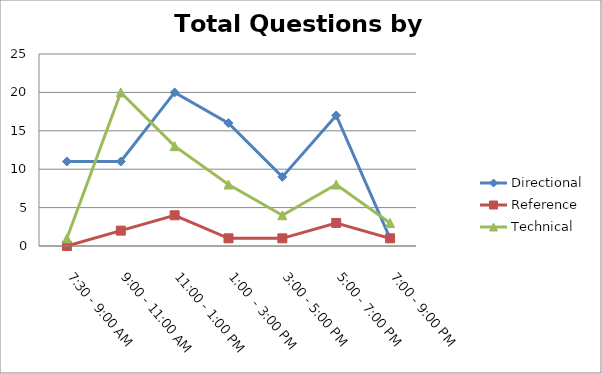
| Category | Directional | Reference | Technical |
|---|---|---|---|
| 7:30 - 9:00 AM | 11 | 0 | 1 |
| 9:00 - 11:00 AM | 11 | 2 | 20 |
| 11:00 - 1:00 PM | 20 | 4 | 13 |
| 1:00  - 3:00 PM | 16 | 1 | 8 |
| 3:00 - 5:00 PM | 9 | 1 | 4 |
| 5:00 - 7:00 PM | 17 | 3 | 8 |
| 7:00 - 9:00 PM | 1 | 1 | 3 |